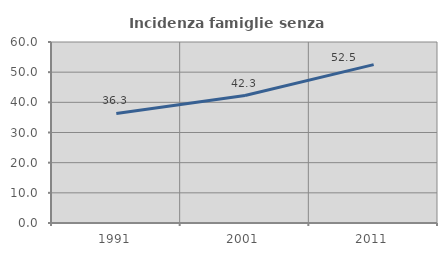
| Category | Incidenza famiglie senza nuclei |
|---|---|
| 1991.0 | 36.331 |
| 2001.0 | 42.254 |
| 2011.0 | 52.495 |